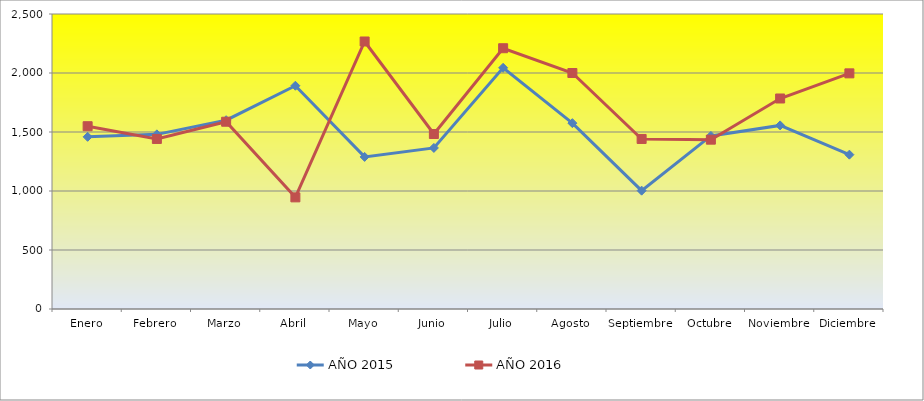
| Category | AÑO 2015 | AÑO 2016 |
|---|---|---|
| Enero | 1459 | 1549 |
| Febrero | 1480 | 1441 |
| Marzo | 1600 | 1587 |
| Abril | 1892 | 946 |
| Mayo | 1289 | 2267 |
| Junio | 1365 | 1483 |
| Julio | 2044 | 2210 |
| Agosto | 1575 | 2000 |
| Septiembre | 1003 | 1441 |
| Octubre | 1467 | 1435 |
| Noviembre | 1556 | 1784 |
| Diciembre | 1308 | 1997 |